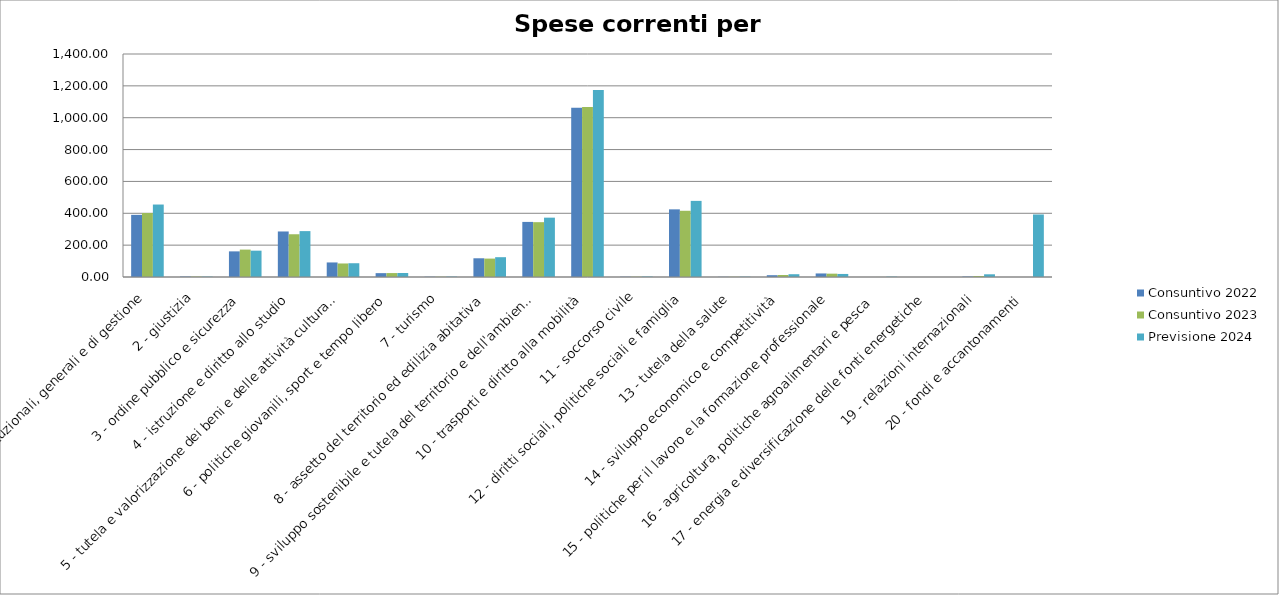
| Category |  Consuntivo 2022  |  Consuntivo 2023  |  Previsione 2024  |
|---|---|---|---|
| 1 - servizi istituzionali, generali e di gestione | 390.09 | 401.84 | 454.95 |
| 2 - giustizia | 2.75 | 2.45 | 2.42 |
| 3 - ordine pubblico e sicurezza | 160.89 | 172.04 | 165.31 |
| 4 - istruzione e diritto allo studio | 285.85 | 268.38 | 288.1 |
| 5 - tutela e valorizzazione dei beni e delle attività culturali | 91.38 | 84.96 | 86.45 |
| 6 - politiche giovanili, sport e tempo libero | 24.22 | 24.67 | 25.06 |
| 7 - turismo | 1.75 | 1.58 | 2.53 |
| 8 - assetto del territorio ed edilizia abitativa | 117.52 | 115.57 | 124.37 |
| 9 - sviluppo sostenibile e tutela del territorio e dell'ambiente | 345.85 | 344.19 | 372.57 |
| 10 - trasporti e diritto alla mobilità | 1062.54 | 1066.87 | 1174.2 |
| 11 - soccorso civile | 1.63 | 1.64 | 2.95 |
| 12 - diritti sociali, politiche sociali e famiglia | 424.7 | 415.7 | 477.88 |
| 13 - tutela della salute | 1.21 | 1.26 | 1.97 |
| 14 - sviluppo economico e competitività | 11.34 | 12.52 | 17.5 |
| 15 - politiche per il lavoro e la formazione professionale | 22.33 | 20.97 | 19.14 |
| 16 - agricoltura, politiche agroalimentari e pesca | 0.17 | 0.31 | 2.32 |
| 17 - energia e diversificazione delle fonti energetiche | 0 | 0.04 | 0.04 |
| 19 - relazioni internazionali | 3.1 | 6.24 | 16.98 |
| 20 - fondi e accantonamenti | 0 | 0 | 392.51 |